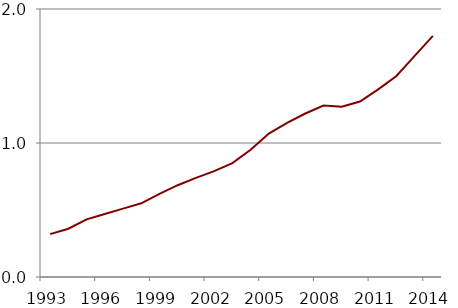
| Category | Series 0 |
|---|---|
| 1993.0 | 0.32 |
| 1994.0 | 0.36 |
| 1995.0 | 0.43 |
| 1996.0 | 0.47 |
| 1997.0 | 0.51 |
| 1998.0 | 0.55 |
| 1999.0 | 0.62 |
| 2000.0 | 0.685 |
| 2001.0 | 0.74 |
| 2002.0 | 0.79 |
| 2003.0 | 0.85 |
| 2004.0 | 0.95 |
| 2005.0 | 1.07 |
| 2006.0 | 1.15 |
| 2007.0 | 1.22 |
| 2008.0 | 1.28 |
| 2009.0 | 1.27 |
| 2010.0 | 1.31 |
| 2011.0 | 1.4 |
| 2012.0 | 1.5 |
| 2013.0 | 1.65 |
| 2014.0 | 1.8 |